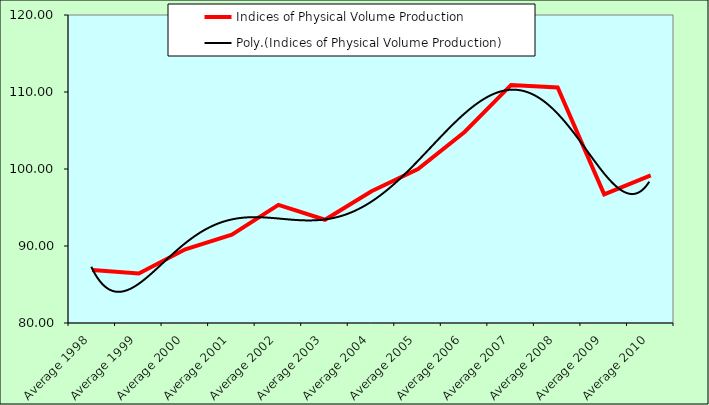
| Category | Indices of Physical Volume Production |
|---|---|
| Average 1998 | 86.875 |
| Average 1999 | 86.433 |
| Average 2000 | 89.567 |
| Average 2001 | 91.467 |
| Average 2002 | 95.342 |
| Average 2003 | 93.408 |
| Average 2004 | 97.117 |
| Average 2005 | 99.983 |
| Average 2006 | 104.808 |
| Average 2007 | 110.918 |
| Average 2008 | 110.583 |
| Average 2009 | 96.7 |
| Average 2010 | 99.162 |